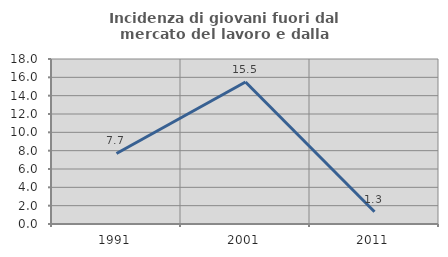
| Category | Incidenza di giovani fuori dal mercato del lavoro e dalla formazione  |
|---|---|
| 1991.0 | 7.692 |
| 2001.0 | 15.493 |
| 2011.0 | 1.333 |